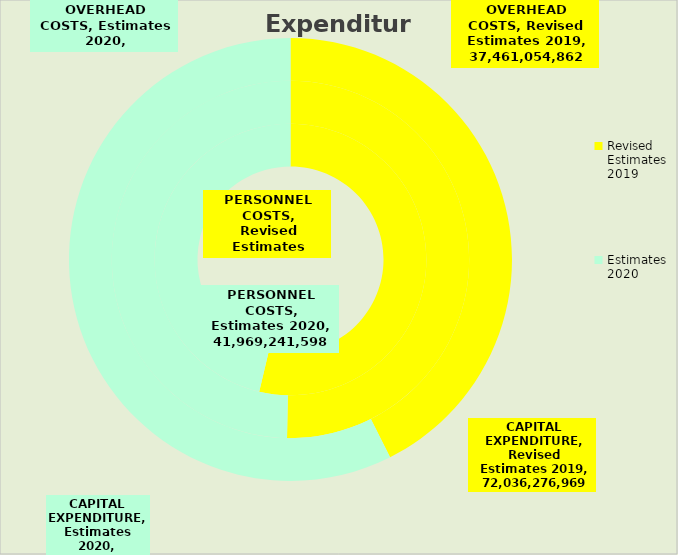
| Category | PERSONNEL COSTS | OVERHEAD COSTS | CAPITAL EXPENDITURE |
|---|---|---|---|
| Revised Estimates 2019 | 48674729140 | 37461054862 | 72036276969 |
| Estimates 2020 | 41969241598.498 | 36999887139 | 97153963194 |